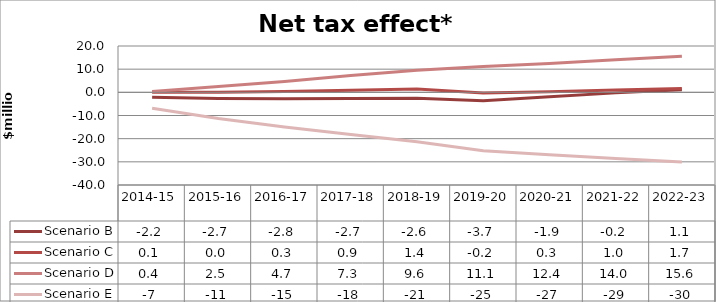
| Category | Scenario B | Scenario C | Scenario D | Scenario E |
|---|---|---|---|---|
| 2014-15 | -2.163 | 0.073 | 0.368 | -6.842 |
| 2015-16 | -2.666 | 0.027 | 2.487 | -11.295 |
| 2016-17 | -2.781 | 0.333 | 4.675 | -14.989 |
| 2017-18 | -2.691 | 0.857 | 7.275 | -18.249 |
| 2018-19 | -2.552 | 1.426 | 9.567 | -21.38 |
| 2019-20 | -3.672 | -0.25 | 11.145 | -25.227 |
| 2020-21 | -1.871 | 0.297 | 12.425 | -26.913 |
| 2021-22 | -0.234 | 0.976 | 14.013 | -28.543 |
| 2022-23 | 1.145 | 1.677 | 15.597 | -30.061 |